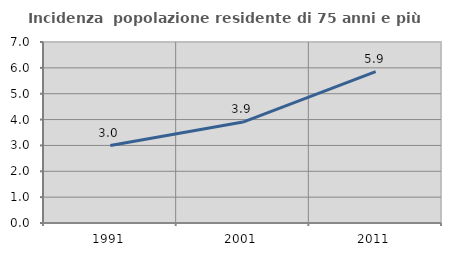
| Category | Incidenza  popolazione residente di 75 anni e più |
|---|---|
| 1991.0 | 2.996 |
| 2001.0 | 3.905 |
| 2011.0 | 5.854 |